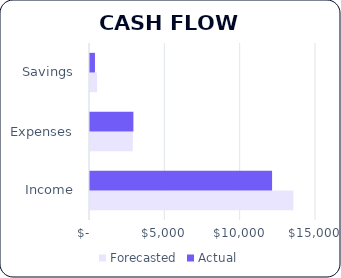
| Category | Forecasted | Actual |
|---|---|---|
| Income | 13500 | 12085 |
| Expenses | 2840 | 2880 |
| Savings | 470 | 330 |